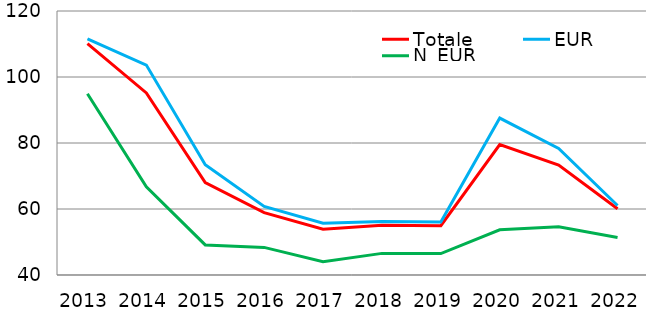
| Category | Totale | EUR | N_EUR |
|---|---|---|---|
| 2013.0 | 110.134 | 111.536 | 94.937 |
| 2014.0 | 95.165 | 103.616 | 66.75 |
| 2015.0 | 68.016 | 73.39 | 49.114 |
| 2016.0 | 58.88 | 60.759 | 48.37 |
| 2017.0 | 53.885 | 55.713 | 44.039 |
| 2018.0 | 55.073 | 56.211 | 46.552 |
| 2019.0 | 54.941 | 56.055 | 46.484 |
| 2020.0 | 79.509 | 87.542 | 53.717 |
| 2021.0 | 73.325 | 78.331 | 54.61 |
| 2022.0 | 60.092 | 61.065 | 51.359 |